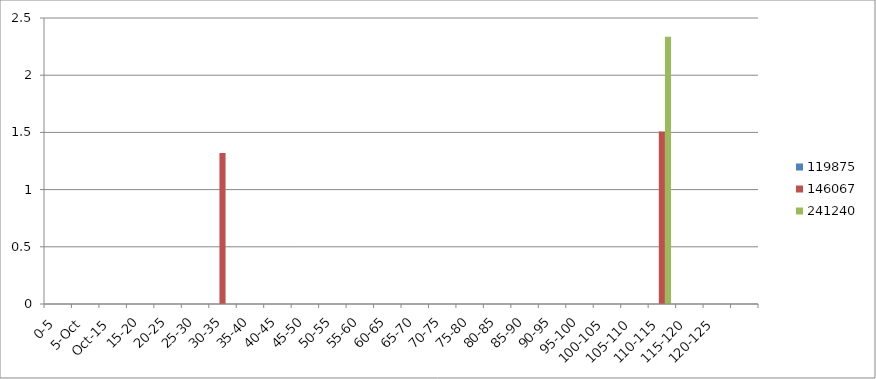
| Category | 119875 | 146067 | 241240 |
|---|---|---|---|
| 0-5 | 0 | 0 | 0 |
| 5.Oct | 0 | 0 | 0 |
| Oct.15 | 0 | 0 | 0 |
| 15-20 | 0 | 0 | 0 |
| 20-25 | 0 | 0 | 0 |
| 25-30 | 0 | 0 | 0 |
| 30-35 | 0 | 1.321 | 0 |
| 35-40 | 0 | 0 | 0 |
| 40-45 | 0 | 0 | 0 |
| 45-50 | 0 | 0 | 0 |
| 50-55 | 0 | 0 | 0 |
| 55-60 | 0 | 0 | 0 |
| 60-65 | 0 | 0 | 0 |
| 65-70 | 0 | 0 | 0 |
| 70-75 | 0 | 0 | 0 |
| 75-80 | 0 | 0 | 0 |
| 80-85 | 0 | 0 | 0 |
| 85-90 | 0 | 0 | 0 |
| 90-95 | 0 | 0 | 0 |
| 95-100 | 0 | 0 | 0 |
| 100-105 | 0 | 0 | 0 |
| 105-110 | 0 | 0 | 0 |
| 110-115 | 0 | 1.507 | 2.335 |
| 115-120 | 0 | 0 | 0 |
| 120-125 | 0 | 0 | 0 |